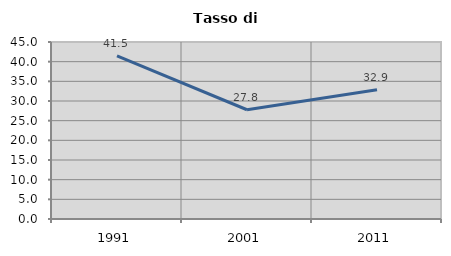
| Category | Tasso di disoccupazione   |
|---|---|
| 1991.0 | 41.477 |
| 2001.0 | 27.778 |
| 2011.0 | 32.867 |